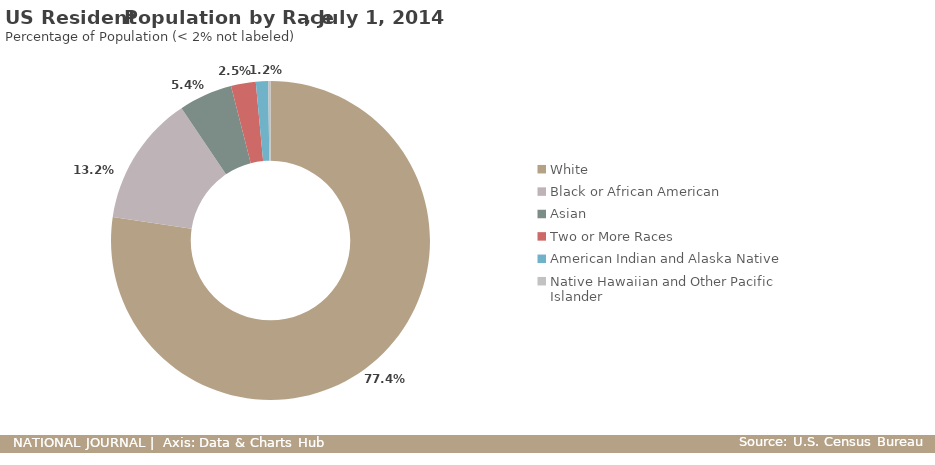
| Category | Percentage of Population by Race |
|---|---|
| White | 0.774 |
| Black or African American | 0.132 |
| Asian | 0.054 |
| Two or More Races | 0.025 |
| American Indian and Alaska Native | 0.012 |
| Native Hawaiian and Other Pacific Islander | 0.002 |